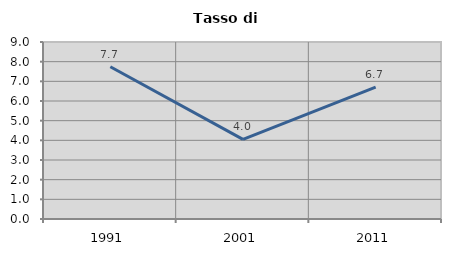
| Category | Tasso di disoccupazione   |
|---|---|
| 1991.0 | 7.739 |
| 2001.0 | 4.047 |
| 2011.0 | 6.701 |